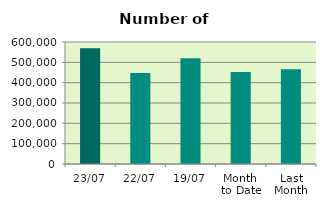
| Category | Series 0 |
|---|---|
| 23/07 | 569116 |
| 22/07 | 447758 |
| 19/07 | 520016 |
| Month 
to Date | 451973.647 |
| Last
Month | 466167.6 |